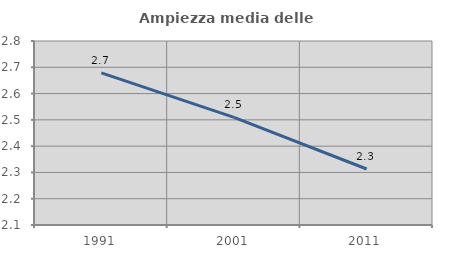
| Category | Ampiezza media delle famiglie |
|---|---|
| 1991.0 | 2.679 |
| 2001.0 | 2.509 |
| 2011.0 | 2.313 |